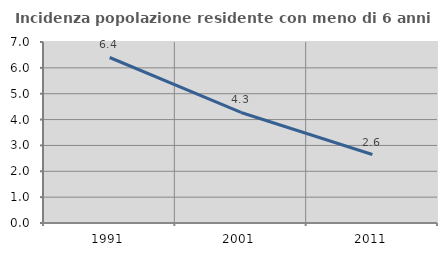
| Category | Incidenza popolazione residente con meno di 6 anni |
|---|---|
| 1991.0 | 6.401 |
| 2001.0 | 4.275 |
| 2011.0 | 2.649 |